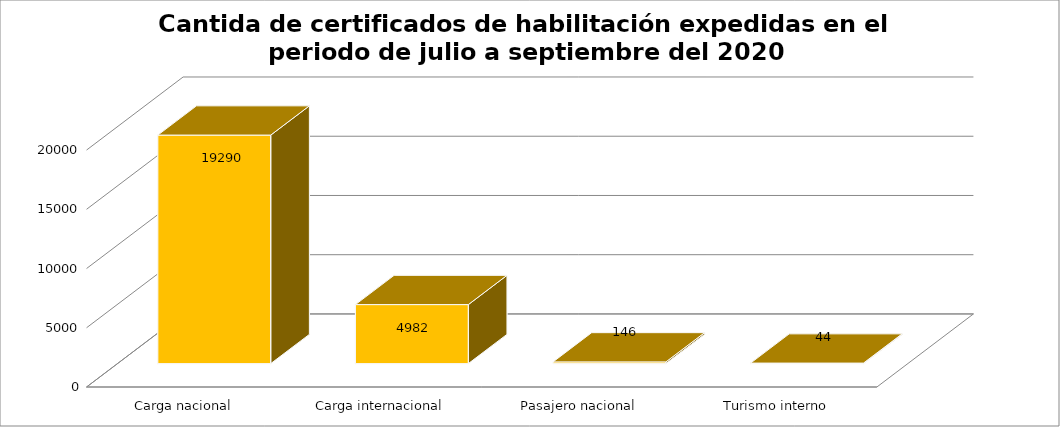
| Category | Series 0 |
|---|---|
| Carga nacional | 19290 |
| Carga internacional | 4982 |
| Pasajero nacional | 146 |
| Turismo interno | 44 |